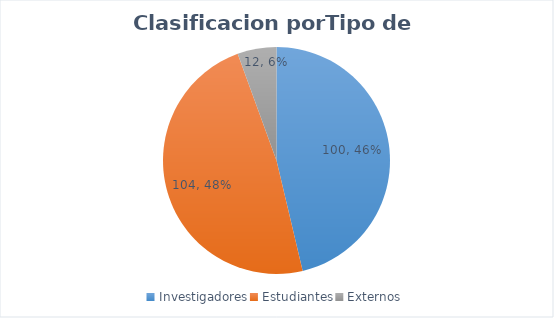
| Category | No. Miembros |
|---|---|
| Investigadores | 100 |
| Estudiantes | 104 |
| Externos | 12 |